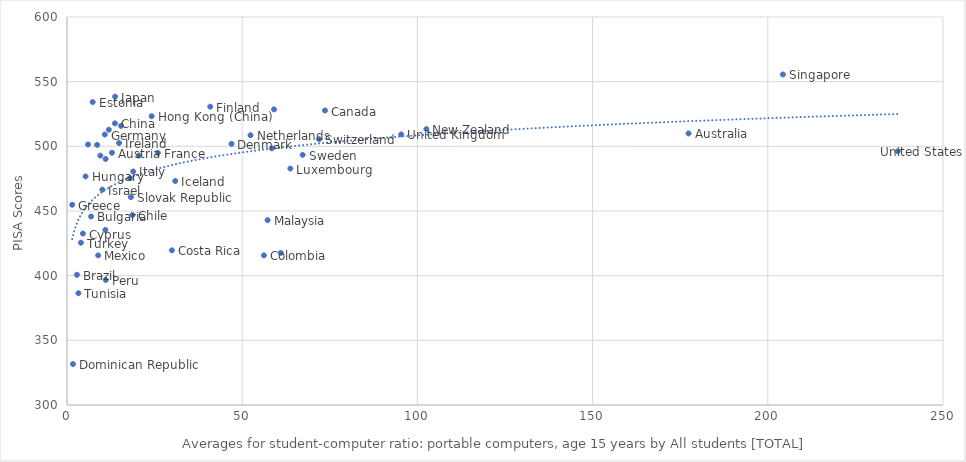
| Category | Series 0 |
|---|---|
| 177.385201877682 | 509.994 |
| 12.8276265450207 | 495.037 |
| 2.83901418715836 | 400.682 |
| 6.88543566564041 | 445.772 |
| 73.6345527138553 | 527.705 |
| 18.689983164645 | 446.956 |
| 13.6793922026645 | 517.779 |
| 56.1907625053557 | 415.729 |
| 29.925005386501 | 419.608 |
| 4.5305621911847 | 432.577 |
| 9.51315343834024 | 492.83 |
| 46.9461774927469 | 501.937 |
| 1.69997308368227 | 331.639 |
| 7.33197963969677 | 534.194 |
| 40.8788595554735 | 530.661 |
| 25.9219342075436 | 494.978 |
| 10.7767013265874 | 509.141 |
| 1.48521742158818 | 454.829 |
| 24.1534949472364 | 523.277 |
| 5.29734016319238 | 476.748 |
| 30.8919462479857 | 473.23 |
| 14.8498788799546 | 502.575 |
| 10.0887702289386 | 466.553 |
| 18.905033624667 | 480.547 |
| 13.7295557447055 | 538.395 |
| 15.4141344949539 | 515.81 |
| 11.0213602747195 | 490.225 |
| 17.9924639211041 | 475.409 |
| 63.7418824938338 | 482.806 |
| 59.0773213523333 | 528.55 |
| 57.2513433874525 | 442.948 |
| 8.89419611531986 | 415.71 |
| 52.3737314888326 | 508.575 |
| 102.55922265358 | 513.304 |
| 58.4612812468322 | 498.481 |
| 11.0802448631868 | 396.684 |
| 6.01793864380011 | 501.435 |
| 8.58820252394696 | 501.1 |
| 61.0 | 417.611 |
| 204.311806098813 | 555.575 |
| 18.2372030136394 | 460.775 |
| 11.9465012308285 | 512.864 |
| 20.4999945748965 | 492.786 |
| 67.2521285009966 | 493.422 |
| 71.9409614877351 | 505.506 |
| 3.26830262372149 | 386.403 |
| 3.97915811673371 | 425.49 |
| 95.3847927361739 | 509.222 |
| 237.102136289601 | 496.242 |
| 10.9574084675309 | 435.363 |